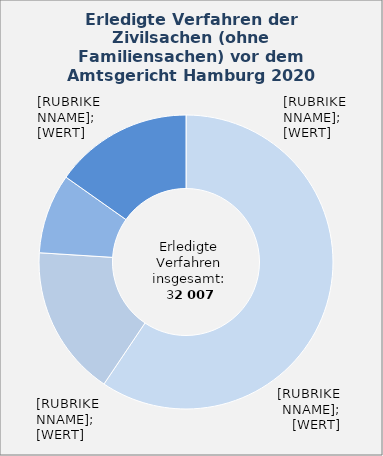
| Category | in Prozent |
|---|---|
| Sonstiger Verfahrensgegenstand | 59.421 |
| Wohnungsmietsachen | 16.584 |
| Verkehrsunfallsachen | 8.789 |
| Übrige Sachgebiete¹ | 15.206 |